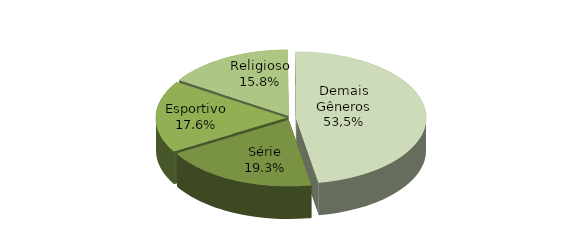
| Category | Series 0 |
|---|---|
| Série | 101305 |
| Esportivo | 92472 |
| Religioso | 82877 |
| Demais Gêneros | 248946 |